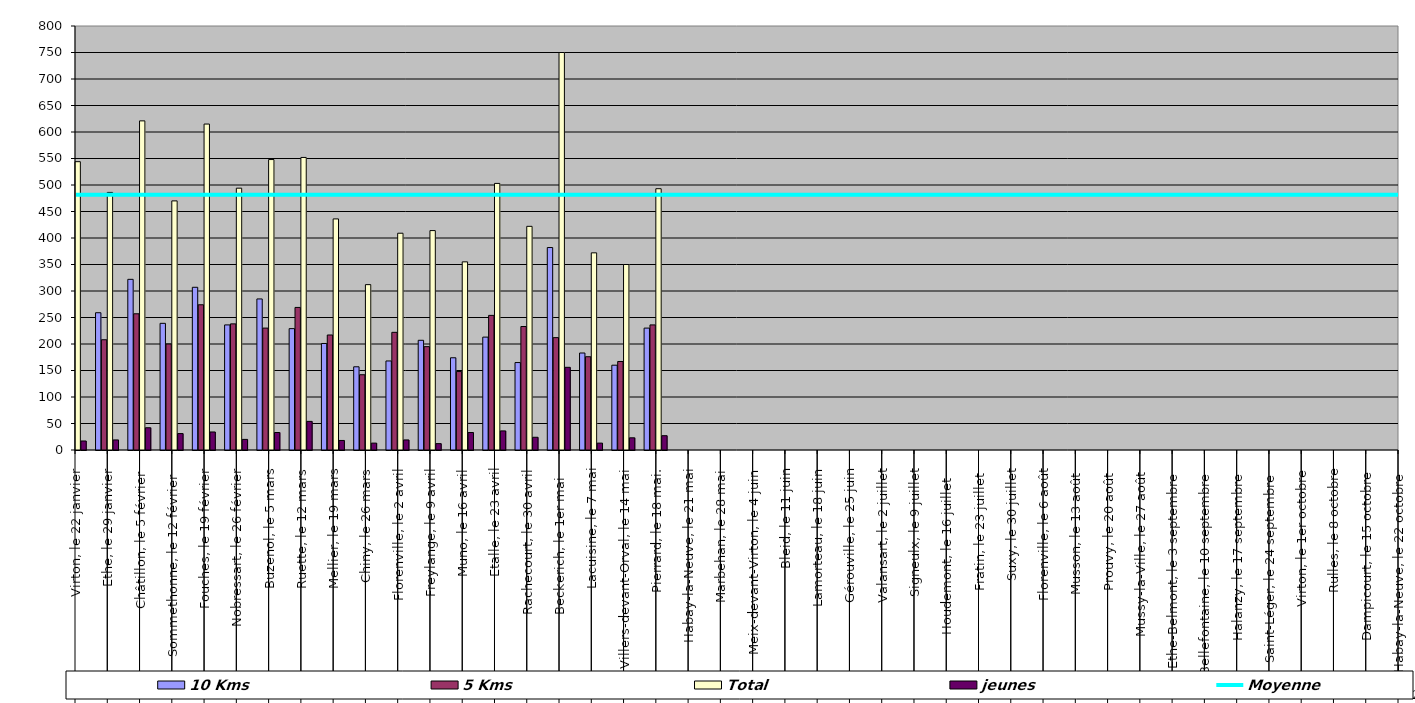
| Category | 10 Kms | 5 Kms | Total | jeunes |
|---|---|---|---|---|
| 0 | 296 | 231 | 544 | 17 |
| 1 | 259 | 208 | 486 | 19 |
| 2 | 322 | 257 | 621 | 42 |
| 3 | 239 | 200 | 470 | 31 |
| 4 | 307 | 274 | 615 | 34 |
| 5 | 236 | 238 | 494 | 20 |
| 6 | 285 | 230 | 548 | 33 |
| 7 | 229 | 269 | 552 | 54 |
| 8 | 201 | 217 | 436 | 18 |
| 9 | 157 | 142 | 312 | 13 |
| 10 | 168 | 222 | 409 | 19 |
| 11 | 207 | 195 | 414 | 12 |
| 12 | 174 | 148 | 355 | 33 |
| 13 | 213 | 254 | 503 | 36 |
| 14 | 165 | 233 | 422 | 24 |
| 15 | 382 | 212 | 750 | 156 |
| 16 | 183 | 176 | 372 | 13 |
| 17 | 160 | 167 | 350 | 23 |
| 18 | 230 | 236 | 493 | 27 |
| 19 | 0 | 0 | 0 | 0 |
| 20 | 0 | 0 | 0 | 0 |
| 21 | 0 | 0 | 0 | 0 |
| 22 | 0 | 0 | 0 | 0 |
| 23 | 0 | 0 | 0 | 0 |
| 24 | 0 | 0 | 0 | 0 |
| 25 | 0 | 0 | 0 | 0 |
| 26 | 0 | 0 | 0 | 0 |
| 27 | 0 | 0 | 0 | 0 |
| 28 | 0 | 0 | 0 | 0 |
| 29 | 0 | 0 | 0 | 0 |
| 30 | 0 | 0 | 0 | 0 |
| 31 | 0 | 0 | 0 | 0 |
| 32 | 0 | 0 | 0 | 0 |
| 33 | 0 | 0 | 0 | 0 |
| 34 | 0 | 0 | 0 | 0 |
| 35 | 0 | 0 | 0 | 0 |
| 36 | 0 | 0 | 0 | 0 |
| 37 | 0 | 0 | 0 | 0 |
| 38 | 0 | 0 | 0 | 0 |
| 39 | 0 | 0 | 0 | 0 |
| 40 | 0 | 0 | 0 | 0 |
| 41 | 0 | 0 | 0 | 0 |